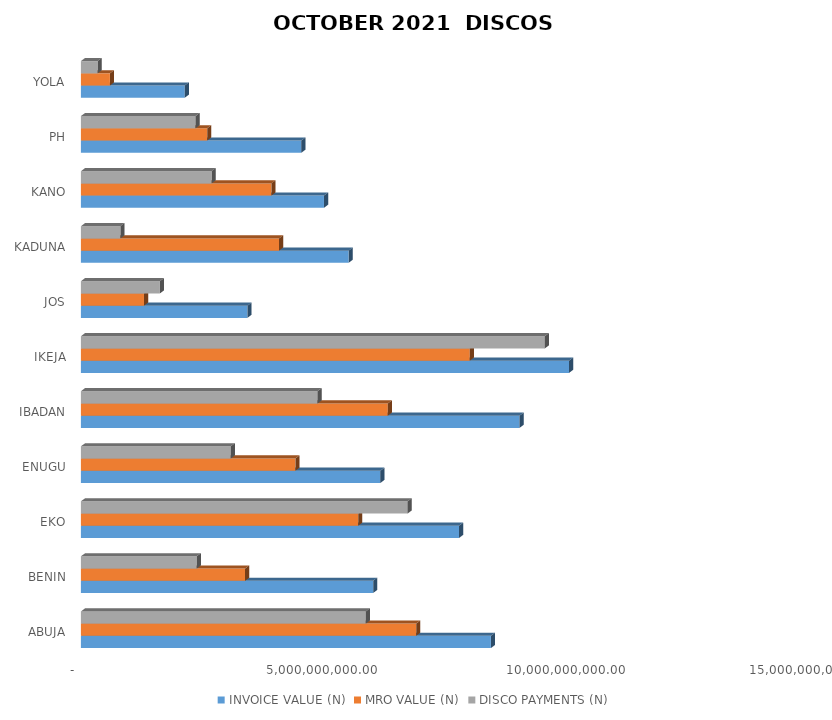
| Category | INVOICE VALUE (N) | MRO VALUE (N) | DISCO PAYMENTS (N) |
|---|---|---|---|
| ABUJA | 8418250945.68 | 6883603798.283 | 5849500894.56 |
| BENIN | 6000295590.644 | 3371566092.383 | 2377752678.39 |
| EKO | 7763177513.095 | 5692738070.352 | 6708161689.07 |
| ENUGU | 6148214654.201 | 4403966156.804 | 3077013241.92 |
| IBADAN | 9005821849.796 | 6300472966.117 | 4859843524.34 |
| IKEJA | 10022734090.672 | 7984109976.629 | 9525606479.77 |
| JOS | 3419110283.194 | 1295158975.274 | 1622541020.76 |
| KADUNA | 5497155298.499 | 4067894920.889 | 810807612.58 |
| KANO | 4990648091.091 | 3911669973.797 | 2684960083.62 |
| PH | 4525274209.675 | 2591624539.881 | 2352542628.42 |
| YOLA | 2131913266.577 | 595443375.355 | 344067862.72 |